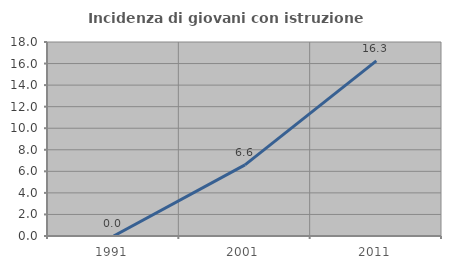
| Category | Incidenza di giovani con istruzione universitaria |
|---|---|
| 1991.0 | 0 |
| 2001.0 | 6.604 |
| 2011.0 | 16.25 |